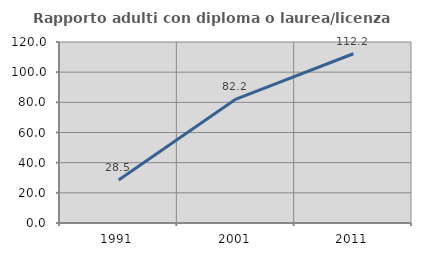
| Category | Rapporto adulti con diploma o laurea/licenza media  |
|---|---|
| 1991.0 | 28.55 |
| 2001.0 | 82.161 |
| 2011.0 | 112.216 |